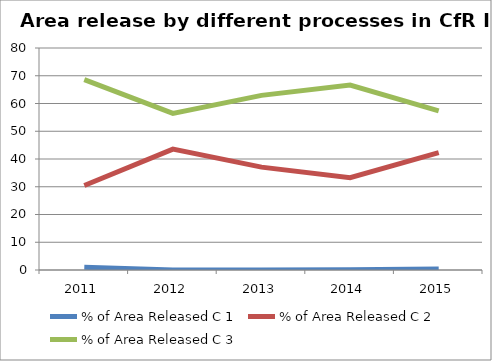
| Category | % of Area Released C 1 | % of Area Released C 2 | % of Area Released C 3 |
|---|---|---|---|
| 2011.0 | 0.97 | 30.43 | 68.6 |
| 2012.0 | 0 | 43.57 | 56.43 |
| 2013.0 | 0 | 37.07 | 62.93 |
| 2014.0 | 0.06 | 33.27 | 66.67 |
| 2015.0 | 0.37 | 42.31 | 57.32 |